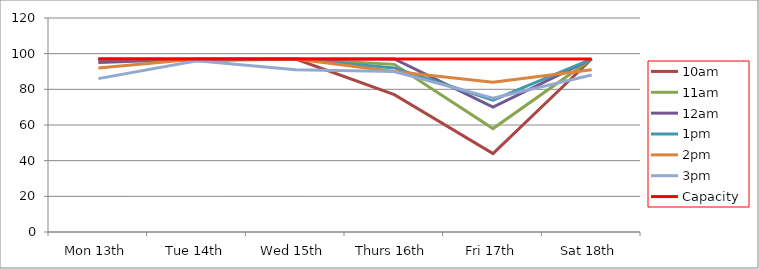
| Category | 9am | 10am | 11am | 12am | 1pm | 2pm | 3pm | 4pm | 5pm | Capacity |
|---|---|---|---|---|---|---|---|---|---|---|
| Mon 13th |  | 97 | 97 | 95 | 97 | 92 | 86 |  |  | 97 |
| Tue 14th |  | 97 | 97 | 97 | 96 | 97 | 96 |  |  | 97 |
| Wed 15th |  | 97 | 97 | 97 | 97 | 97 | 91 |  |  | 97 |
| Thurs 16th |  | 77 | 94 | 97 | 92 | 90 | 90 |  |  | 97 |
| Fri 17th |  | 44 | 58 | 70 | 74 | 84 | 75 |  |  | 97 |
| Sat 18th |  | 97 | 97 | 97 | 97 | 91 | 88 |  |  | 97 |